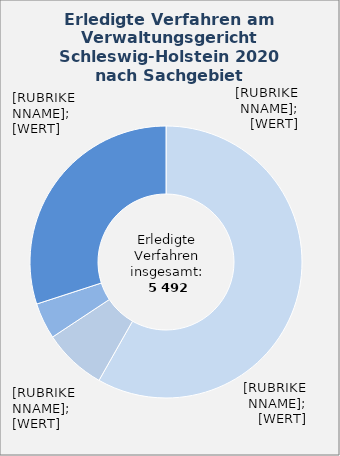
| Category | in Prozent |
|---|---|
| Asylrecht - Hauptsacheverfahren (Asylrecht, Verteilung von Asylbewerbenden) | 0.582 |
| Asylrecht - Hauptsacheverfahren (Dublin-Verfahren nach § 29 Absatz 1 Nummer 1 Buchstabe a) AsylG) | 0.075 |
| Bildungsrecht und Sport 
(ohne NC-Verfahren) | 0.043 |
| Übrige Sachgebiete¹ | 0.3 |